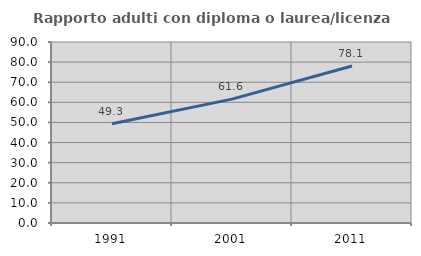
| Category | Rapporto adulti con diploma o laurea/licenza media  |
|---|---|
| 1991.0 | 49.345 |
| 2001.0 | 61.583 |
| 2011.0 | 78.088 |